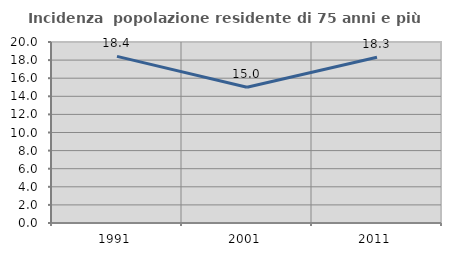
| Category | Incidenza  popolazione residente di 75 anni e più |
|---|---|
| 1991.0 | 18.411 |
| 2001.0 | 15 |
| 2011.0 | 18.31 |